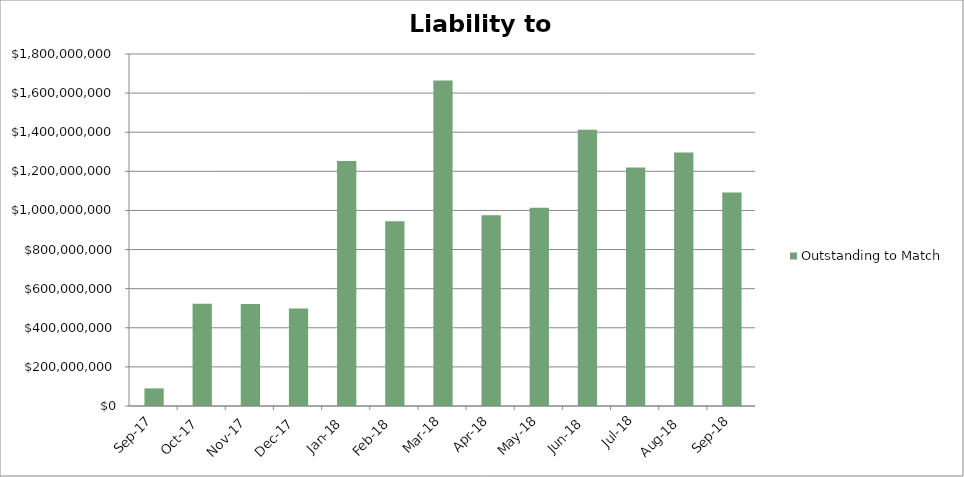
| Category | Outstanding to Match |
|---|---|
| 2017-09-01 | 90000000 |
| 2017-10-01 | 523000000 |
| 2017-11-01 | 521250000 |
| 2017-12-01 | 498000000 |
| 2018-01-01 | 1253000000 |
| 2018-02-01 | 945000000 |
| 2018-03-01 | 1665000000 |
| 2018-04-01 | 975000000 |
| 2018-05-01 | 1014000000 |
| 2018-06-01 | 1413000000 |
| 2018-07-18 | 1220000000 |
| 2018-08-18 | 1296000000 |
| 2018-09-18 | 1092000000 |